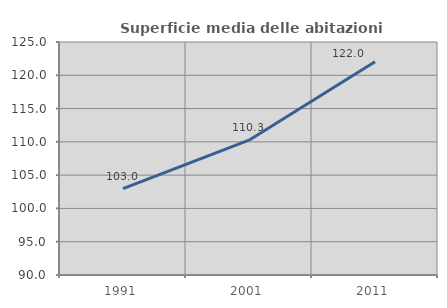
| Category | Superficie media delle abitazioni occupate |
|---|---|
| 1991.0 | 102.961 |
| 2001.0 | 110.25 |
| 2011.0 | 122.025 |